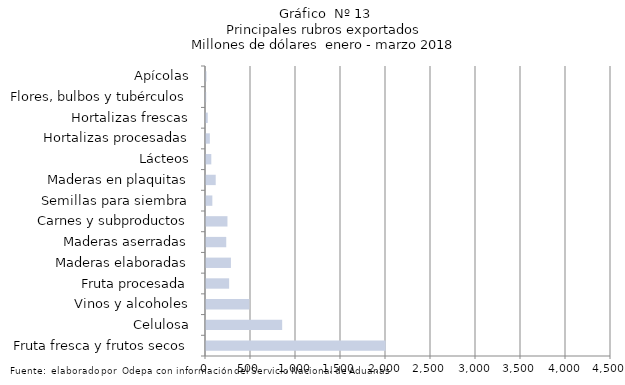
| Category | Series 7 |
|---|---|
| Fruta fresca y frutos secos | 1996046.155 |
| Celulosa | 846319.557 |
| Vinos y alcoholes | 482542.597 |
| Fruta procesada | 256891.6 |
| Maderas elaboradas | 276864.007 |
| Maderas aserradas | 224897.083 |
| Carnes y subproductos | 238387.868 |
| Semillas para siembra | 70492.014 |
| Maderas en plaquitas | 107920.42 |
| Lácteos | 58857.248 |
| Hortalizas procesadas | 42713.596 |
| Hortalizas frescas | 19476.573 |
| Flores, bulbos y tubérculos | 2221.152 |
| Apícolas | 5184.775 |